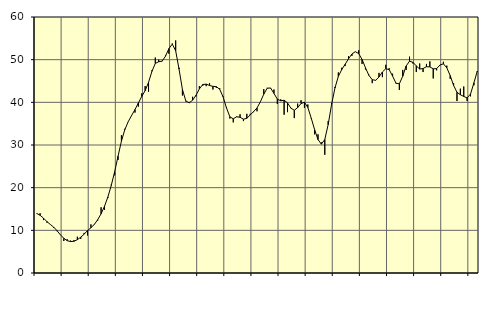
| Category | Piggar | Series 1 |
|---|---|---|
| nan | 13.9 | 13.96 |
| 87.0 | 14 | 13.53 |
| 87.0 | 12.4 | 12.86 |
| 87.0 | 11.8 | 12.06 |
| nan | 11.4 | 11.39 |
| 88.0 | 10.6 | 10.76 |
| 88.0 | 9.8 | 9.91 |
| 88.0 | 9 | 8.95 |
| nan | 7.5 | 8.14 |
| 89.0 | 7.9 | 7.58 |
| 89.0 | 7.6 | 7.36 |
| 89.0 | 7.7 | 7.44 |
| nan | 8.5 | 7.81 |
| 90.0 | 8 | 8.39 |
| 90.0 | 9.4 | 9.1 |
| 90.0 | 8.8 | 9.94 |
| nan | 11.4 | 10.61 |
| 91.0 | 11.3 | 11.38 |
| 91.0 | 12.3 | 12.5 |
| 91.0 | 15.4 | 13.87 |
| nan | 14.8 | 15.62 |
| 92.0 | 17.6 | 17.81 |
| 92.0 | 20.7 | 20.52 |
| 92.0 | 22.9 | 23.73 |
| nan | 26.5 | 27.37 |
| 93.0 | 32.3 | 30.9 |
| 93.0 | 33.8 | 33.6 |
| 93.0 | 35.5 | 35.46 |
| nan | 37 | 36.92 |
| 94.0 | 37.6 | 38.31 |
| 94.0 | 39 | 39.85 |
| 94.0 | 42.1 | 41.38 |
| nan | 43.8 | 42.73 |
| 95.0 | 42.5 | 44.69 |
| 95.0 | 47.5 | 47.26 |
| 95.0 | 50.5 | 49.13 |
| nan | 50 | 49.51 |
| 96.0 | 49.7 | 49.65 |
| 96.0 | 51 | 50.81 |
| 96.0 | 51.4 | 52.59 |
| nan | 53.8 | 53.65 |
| 97.0 | 54.5 | 52.09 |
| 97.0 | 48.1 | 47.79 |
| 97.0 | 41.6 | 43.02 |
| nan | 40.2 | 40.33 |
| 98.0 | 40.1 | 39.88 |
| 98.0 | 41.3 | 40.5 |
| 98.0 | 41.4 | 41.65 |
| nan | 43.8 | 43.15 |
| 99.0 | 43.9 | 44.18 |
| 99.0 | 43.8 | 44.27 |
| 99.0 | 44.5 | 43.94 |
| nan | 43 | 43.75 |
| 0.0 | 43.4 | 43.67 |
| 0.0 | 43.3 | 43.07 |
| 0.0 | 41.4 | 41.26 |
| nan | 38.9 | 38.68 |
| 1.0 | 36.2 | 36.61 |
| 1.0 | 35.3 | 36.15 |
| 1.0 | 36.7 | 36.61 |
| nan | 37.2 | 36.5 |
| 2.0 | 35.6 | 36.05 |
| 2.0 | 37.3 | 36.25 |
| 2.0 | 37.3 | 37.06 |
| nan | 37.7 | 37.83 |
| 3.0 | 37.9 | 38.69 |
| 3.0 | 40.1 | 40.12 |
| 3.0 | 43.1 | 41.92 |
| nan | 43.4 | 43.3 |
| 4.0 | 43.3 | 43.37 |
| 4.0 | 43 | 42.1 |
| 4.0 | 39.6 | 40.75 |
| nan | 40.7 | 40.36 |
| 5.0 | 37.1 | 40.49 |
| 5.0 | 37.7 | 39.87 |
| 5.0 | 38.7 | 38.64 |
| nan | 36.3 | 38.14 |
| 6.0 | 39.7 | 38.77 |
| 6.0 | 40.5 | 39.71 |
| 6.0 | 38.7 | 40.02 |
| nan | 39.5 | 38.79 |
| 7.0 | 36.2 | 36.3 |
| 7.0 | 32.5 | 33.59 |
| 7.0 | 32.5 | 31.27 |
| nan | 30.6 | 30.2 |
| 8.0 | 27.7 | 31.29 |
| 8.0 | 35.6 | 34.79 |
| 8.0 | 39.8 | 39.49 |
| nan | 43.6 | 43.36 |
| 9.0 | 47 | 46.08 |
| 9.0 | 48.1 | 47.67 |
| 9.0 | 48.5 | 48.91 |
| nan | 50.8 | 50.2 |
| 10.0 | 50.9 | 51.33 |
| 10.0 | 51.9 | 51.87 |
| 10.0 | 52.2 | 51.43 |
| nan | 49 | 50.06 |
| 11.0 | 47.7 | 48.12 |
| 11.0 | 46.5 | 46.33 |
| 11.0 | 44.5 | 45.31 |
| nan | 45.1 | 45.16 |
| 12.0 | 46.9 | 45.95 |
| 12.0 | 45.9 | 47.11 |
| 12.0 | 48.8 | 47.88 |
| nan | 48 | 47.66 |
| 13.0 | 46.7 | 46.16 |
| 13.0 | 44.4 | 44.49 |
| 13.0 | 42.9 | 44.34 |
| nan | 47.6 | 46.13 |
| 14.0 | 47.6 | 48.52 |
| 14.0 | 50.7 | 49.65 |
| 14.0 | 49.1 | 49.38 |
| nan | 47.1 | 48.54 |
| 15.0 | 49.1 | 47.8 |
| 15.0 | 47.1 | 47.92 |
| 15.0 | 49 | 48.35 |
| nan | 49.6 | 48.31 |
| 16.0 | 45.6 | 47.85 |
| 16.0 | 47.5 | 47.91 |
| 16.0 | 48.7 | 48.76 |
| nan | 49.5 | 49.02 |
| 17.0 | 48.6 | 48.09 |
| 17.0 | 45.5 | 46.27 |
| 17.0 | 44.5 | 43.97 |
| nan | 40.3 | 42.37 |
| 18.0 | 43.2 | 41.78 |
| 18.0 | 43.7 | 41.38 |
| 18.0 | 40.3 | 41.04 |
| nan | 41.4 | 41.94 |
| 19.0 | 44 | 44.57 |
| 19.0 | 47.2 | 47.34 |